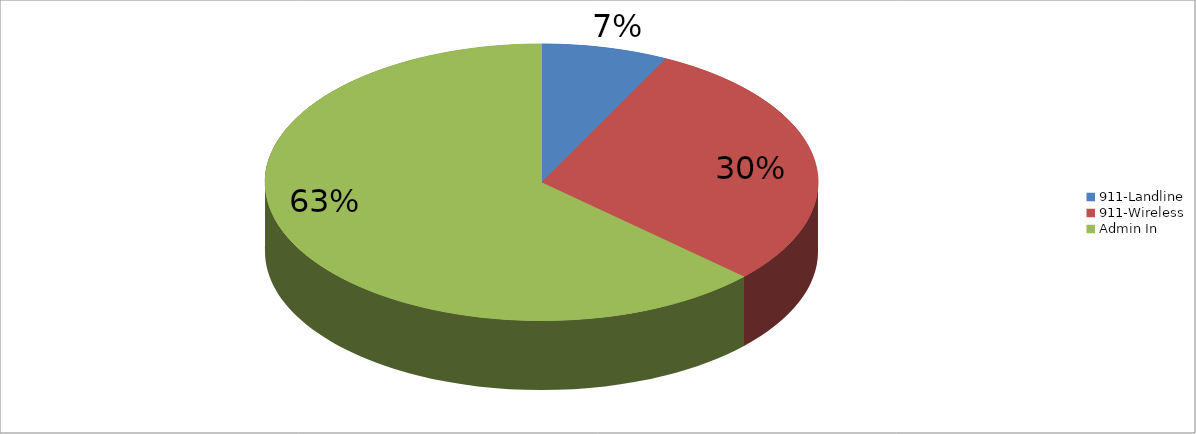
| Category | Series 0 |
|---|---|
| 911-Landline | 6232 |
| 911-Wireless | 24827 |
| Admin In | 53066 |